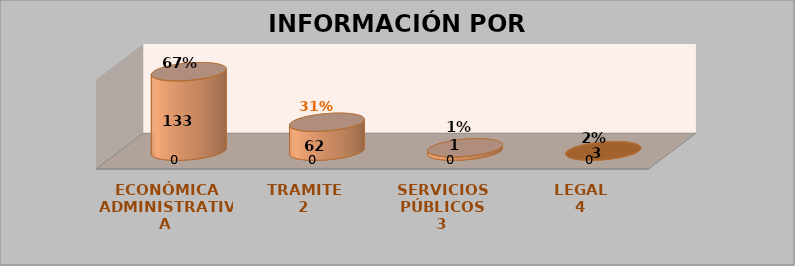
| Category | Series 0 | Series 1 | Series 2 | Series 3 |
|---|---|---|---|---|
| 0 |  |  | 311 | 0.708 |
| 1 |  |  | 113 | 0.257 |
| 2 |  |  | 13 | 0.03 |
| 3 |  |  | 2 | 0.005 |